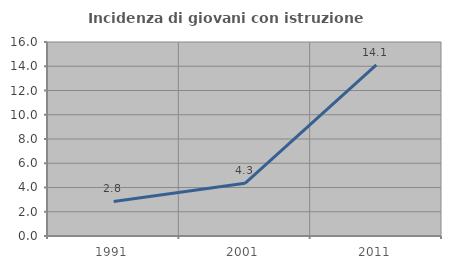
| Category | Incidenza di giovani con istruzione universitaria |
|---|---|
| 1991.0 | 2.848 |
| 2001.0 | 4.348 |
| 2011.0 | 14.113 |